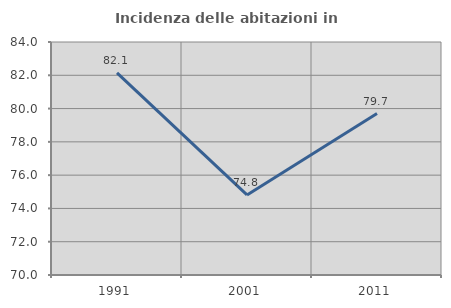
| Category | Incidenza delle abitazioni in proprietà  |
|---|---|
| 1991.0 | 82.143 |
| 2001.0 | 74.809 |
| 2011.0 | 79.699 |